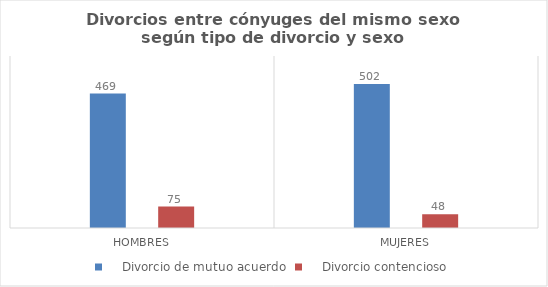
| Category |     Divorcio de mutuo acuerdo |     Divorcio contencioso |
|---|---|---|
| Hombres | 469 | 75 |
| Mujeres | 502 | 48 |